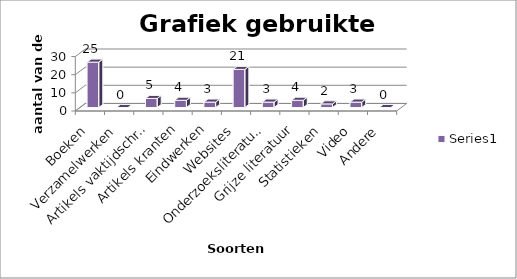
| Category | Series 0 |
|---|---|
| Boeken | 25 |
| Verzamelwerken | 0 |
| Artikels vaktijdschriften | 5 |
| Artikels kranten | 4 |
| Eindwerken | 3 |
| Websites | 21 |
| Onderzoeksliteratuur | 3 |
| Grijze literatuur | 4 |
| Statistieken | 2 |
| Video | 3 |
| Andere | 0 |